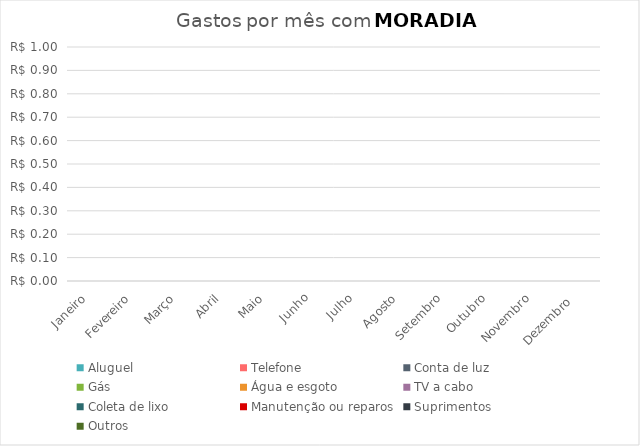
| Category | Aluguel | Telefone | Conta de luz | Gás | Água e esgoto | TV a cabo | Coleta de lixo | Manutenção ou reparos | Suprimentos | Outros |
|---|---|---|---|---|---|---|---|---|---|---|
| Janeiro | 0 | 0 | 0 | 0 | 0 | 0 | 0 | 0 | 0 | 0 |
| Fevereiro | 0 | 0 | 0 | 0 | 0 | 0 | 0 | 0 | 0 | 0 |
| Março | 0 | 0 | 0 | 0 | 0 | 0 | 0 | 0 | 0 | 0 |
| Abril | 0 | 0 | 0 | 0 | 0 | 0 | 0 | 0 | 0 | 0 |
| Maio | 0 | 0 | 0 | 0 | 0 | 0 | 0 | 0 | 0 | 0 |
| Junho | 0 | 0 | 0 | 0 | 0 | 0 | 0 | 0 | 0 | 0 |
| Julho | 0 | 0 | 0 | 0 | 0 | 0 | 0 | 0 | 0 | 0 |
| Agosto | 0 | 0 | 0 | 0 | 0 | 0 | 0 | 0 | 0 | 0 |
| Setembro | 0 | 0 | 0 | 0 | 0 | 0 | 0 | 0 | 0 | 0 |
| Outubro | 0 | 0 | 0 | 0 | 0 | 0 | 0 | 0 | 0 | 0 |
| Novembro | 0 | 0 | 0 | 0 | 0 | 0 | 0 | 0 | 0 | 0 |
| Dezembro  | 0 | 0 | 0 | 0 | 0 | 0 | 0 | 0 | 0 | 0 |